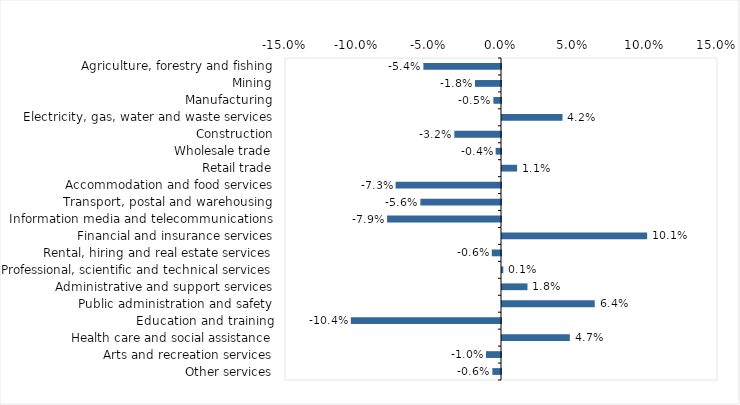
| Category | This week |
|---|---|
| Agriculture, forestry and fishing | -0.054 |
| Mining | -0.018 |
| Manufacturing | -0.005 |
| Electricity, gas, water and waste services | 0.042 |
| Construction | -0.032 |
| Wholesale trade | -0.004 |
| Retail trade | 0.01 |
| Accommodation and food services | -0.073 |
| Transport, postal and warehousing | -0.056 |
| Information media and telecommunications | -0.079 |
| Financial and insurance services | 0.101 |
| Rental, hiring and real estate services | -0.006 |
| Professional, scientific and technical services | 0.001 |
| Administrative and support services | 0.018 |
| Public administration and safety | 0.064 |
| Education and training | -0.104 |
| Health care and social assistance | 0.047 |
| Arts and recreation services | -0.01 |
| Other services | -0.006 |